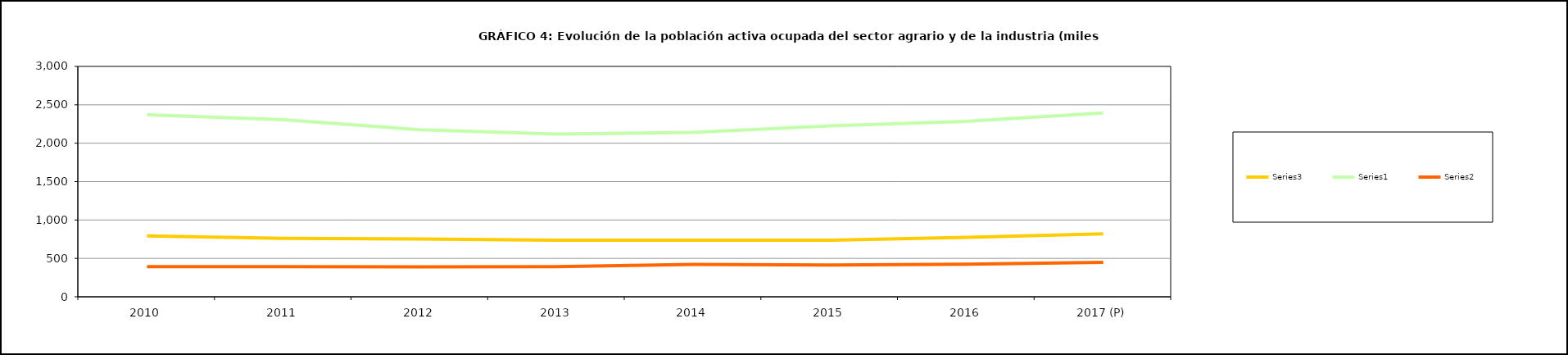
| Category | Series 3 | Series 0 | Series 1 |
|---|---|---|---|
| 2010 | 792.975 | 2370.1 | 392.275 |
| 2011 | 760.15 | 2304.9 | 393.05 |
| 2012 | 753.225 | 2175.575 | 388.925 |
| 2013 | 736.6 | 2118.7 | 393.3 |
| 2014 | 735.85 | 2141.4 | 420.65 |
| 2015 | 736.75 | 2225.025 | 414.025 |
| 2016 | 774.5 | 2284.2 | 423.7 |
| 2017 (P) | 819.5 | 2393.4 | 448 |